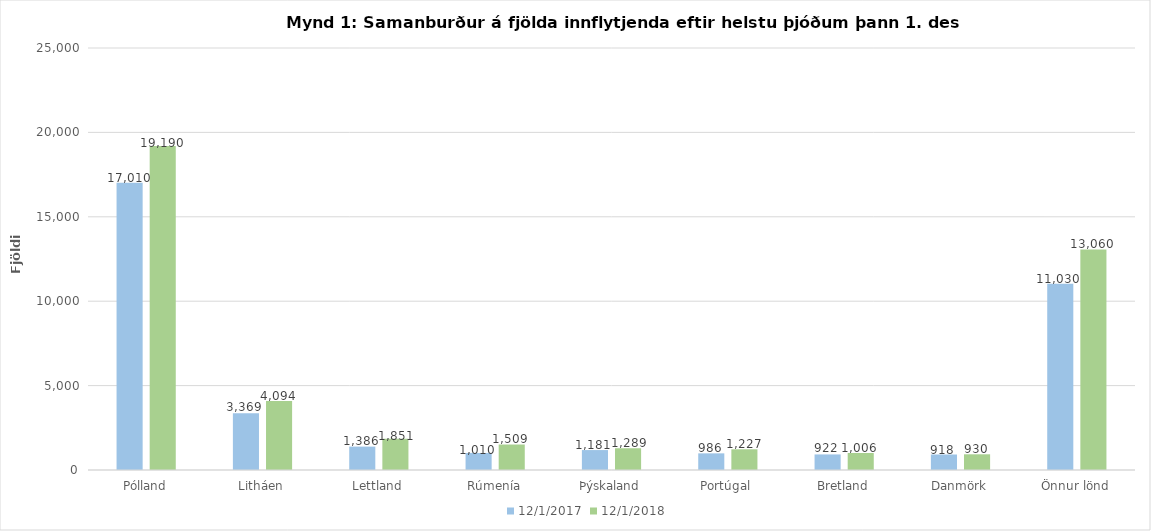
| Category | 1.12.2017 | 1.12.2018 |
|---|---|---|
| Pólland | 17010 | 19190 |
| Litháen | 3369 | 4094 |
| Lettland | 1386 | 1851 |
| Rúmenía | 1010 | 1509 |
| Þýskaland | 1181 | 1289 |
| Portúgal | 986 | 1227 |
| Bretland | 922 | 1006 |
| Danmörk | 918 | 930 |
| Önnur lönd | 11030 | 13060 |